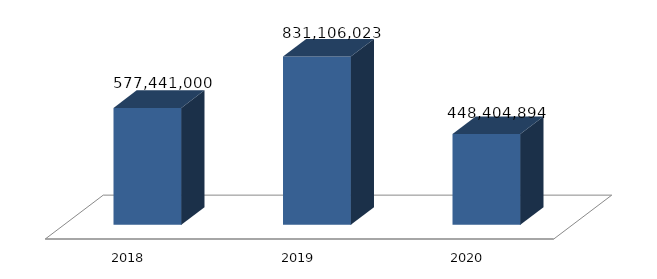
| Category | Pelaksanaan Diplomasi dan Kerjasama Internasional pada Perwakilan RI di Luar Negeri |
|---|---|
| 2018.0 | 577441000 |
| 2019.0 | 831106023 |
| 2020.0 | 448404894 |